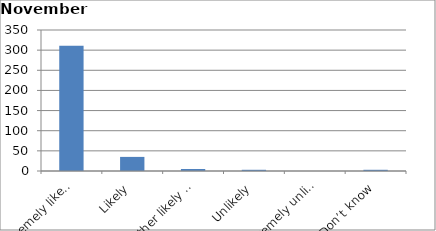
| Category | Series 0 |
|---|---|
| Extremely likely | 311 |
| Likely | 35 |
| Neither likely nor unlikely | 5 |
| Unlikely | 3 |
| Extremely unlikely | 0 |
| Don’t know | 3 |